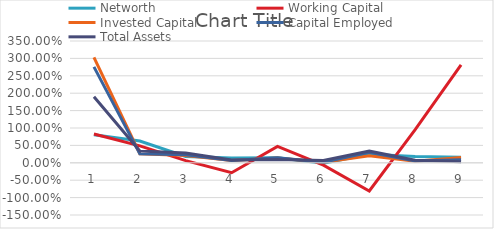
| Category | Networth | Working Capital | Invested Capital | Capital Employed | Total Assets |
|---|---|---|---|---|---|
| 0 | 0.807 | 0.828 | 3.03 | 2.758 | 1.897 |
| 1 | 0.625 | 0.486 | 0.256 | 0.256 | 0.336 |
| 2 | 0.182 | 0.063 | 0.207 | 0.233 | 0.283 |
| 3 | 0.14 | -0.284 | 0.065 | 0.066 | 0.082 |
| 4 | 0.142 | 0.473 | 0.138 | 0.143 | 0.096 |
| 5 | -0.01 | -0.069 | 0.018 | 0.019 | 0.07 |
| 6 | 0.243 | -0.81 | 0.201 | 0.3 | 0.336 |
| 7 | 0.18 | 0.956 | 0.048 | 0.05 | 0.074 |
| 8 | 0.161 | 2.816 | 0.156 | 0.09 | 0.032 |